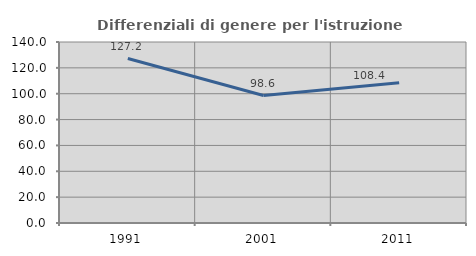
| Category | Differenziali di genere per l'istruzione superiore |
|---|---|
| 1991.0 | 127.209 |
| 2001.0 | 98.584 |
| 2011.0 | 108.397 |